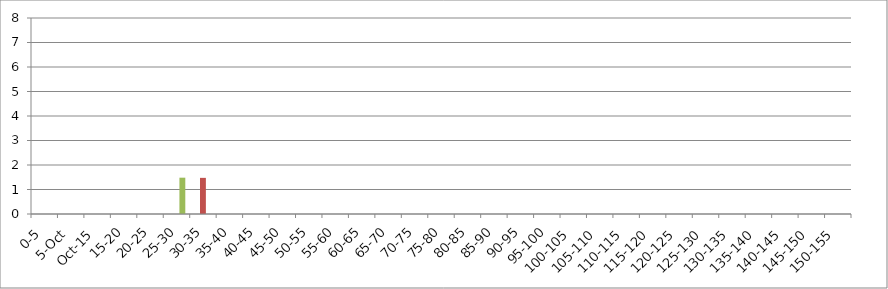
| Category | 119875 | 146067 | 241240 |
|---|---|---|---|
| 0-5 | 0 | 0 | 0 |
| 5-Oct | 0 | 0 | 0 |
| Oct-15 | 0 | 0 | 0 |
| 15-20 | 0 | 0 | 0 |
| 20-25 | 0 | 0 | 0 |
| 25-30 | 0 | 0 | 1.482 |
| 30-35 | 0 | 1.475 | 0 |
| 35-40 | 0 | 0 | 0 |
| 40-45 | 0 | 0 | 0 |
| 45-50 | 0 | 0 | 0 |
| 50-55 | 0 | 0 | 0 |
| 55-60 | 0 | 0 | 0 |
| 60-65 | 0 | 0 | 0 |
| 65-70 | 0 | 0 | 0 |
| 70-75 | 0 | 0 | 0 |
| 75-80 | 0 | 0 | 0 |
| 80-85 | 0 | 0 | 0 |
| 85-90 | 0 | 0 | 0 |
| 90-95 | 0 | 0 | 0 |
| 95-100 | 0 | 0 | 0 |
| 100-105 | 0 | 0 | 0 |
| 105-110 | 0 | 0 | 0 |
| 110-115 | 0 | 0 | 0 |
| 115-120 | 0 | 0 | 0 |
| 120-125 | 0 | 0 | 0 |
| 125-130 | 0 | 0 | 0 |
| 130-135 | 0 | 0 | 0 |
| 135-140 | 0 | 0 | 0 |
| 140-145 | 0 | 0 | 0 |
| 145-150 | 0 | 0 | 0 |
| 150-155 | 0 | 0 | 0 |